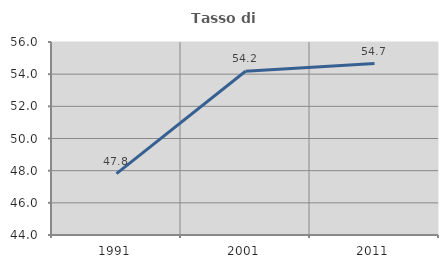
| Category | Tasso di occupazione   |
|---|---|
| 1991.0 | 47.812 |
| 2001.0 | 54.182 |
| 2011.0 | 54.659 |